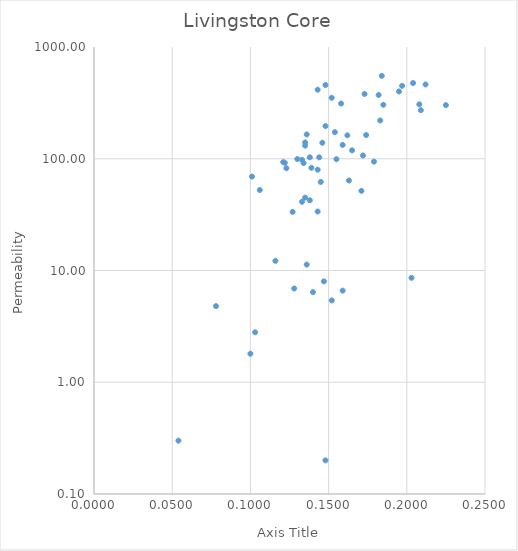
| Category | Series 0 |
|---|---|
| 0.019 | 0 |
| 0.016 | 0 |
| 0.011000000000000001 | 0 |
| 0.044000000000000004 | 0 |
| 0.02 | 0 |
| 0.162 | 162 |
| 0.133 | 97.7 |
| 0.121 | 93.3 |
| 0.106 | 52.5 |
| 0.078 | 4.8 |
| 0.1 | 1.8 |
| 0.136 | 11.3 |
| 0.225 | 302 |
| 0.195 | 400 |
| 0.185 | 304 |
| 0.136 | 165 |
| 0.179 | 94.2 |
| 0.209 | 272 |
| 0.212 | 462 |
| 0.158 | 312 |
| 0.128 | 6.9 |
| 0.203 | 8.6 |
| 0.14300000000000002 | 415 |
| 0.204 | 476 |
| 0.20800000000000002 | 307 |
| 0.183 | 220 |
| 0.17300000000000001 | 380 |
| 0.184 | 552 |
| 0.147 | 8 |
| 0.11599999999999999 | 12.2 |
| 0.152 | 351 |
| 0.14 | 6.4 |
| 0.152 | 5.4 |
| 0.10300000000000001 | 2.8 |
| 0.135 | 44.9 |
| 0.122 | 92 |
| 0.19699999999999998 | 449 |
| 0.135 | 140 |
| 0.134 | 91.5 |
| 0.13 | 99.4 |
| 0.155 | 99.1 |
| 0.127 | 33.5 |
| 0.138 | 42.5 |
| 0.14300000000000002 | 79.8 |
| 0.146 | 139 |
| 0.154 | 173 |
| 0.14800000000000002 | 457 |
| 0.182 | 372 |
| 0.14800000000000002 | 0.2 |
| 0.14300000000000002 | 33.7 |
| 0.14800000000000002 | 196 |
| 0.174 | 163 |
| 0.14400000000000002 | 103 |
| 0.165 | 119 |
| 0.163 | 63.9 |
| 0.172 | 107 |
| 0.171 | 51.6 |
| 0.159 | 6.6 |
| 0.145 | 62 |
| 0.12300000000000001 | 82.3 |
| 0.133 | 41.2 |
| 0.138 | 103 |
| 0.10099999999999999 | 69.3 |
| 0.054000000000000006 | 0.3 |
| 0.135 | 131 |
| 0.159 | 133 |
| 0.139 | 83 |